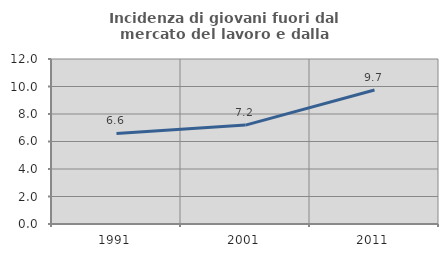
| Category | Incidenza di giovani fuori dal mercato del lavoro e dalla formazione  |
|---|---|
| 1991.0 | 6.582 |
| 2001.0 | 7.193 |
| 2011.0 | 9.745 |